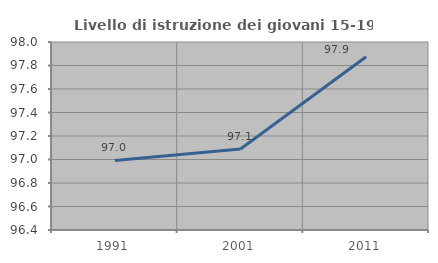
| Category | Livello di istruzione dei giovani 15-19 anni |
|---|---|
| 1991.0 | 96.992 |
| 2001.0 | 97.089 |
| 2011.0 | 97.875 |